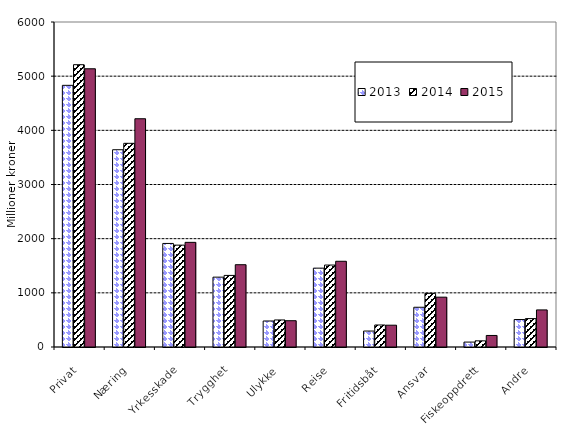
| Category | 2013 | 2014 | 2015 |
|---|---|---|---|
| Privat | 4830.734 | 5211.684 | 5136.589 |
| Næring | 3642.079 | 3760.147 | 4213.957 |
| Yrkesskade | 1911.742 | 1880.638 | 1931.922 |
| Trygghet | 1289.461 | 1321.528 | 1519.225 |
| Ulykke | 480.161 | 499.202 | 485.321 |
| Reise | 1455.682 | 1512.762 | 1582.571 |
| Fritidsbåt | 294.694 | 406.254 | 402.521 |
| Ansvar | 733.659 | 990.363 | 920.036 |
| Fiskeoppdrett | 90.619 | 113.816 | 213.021 |
| Andre | 507.031 | 524.325 | 684.532 |